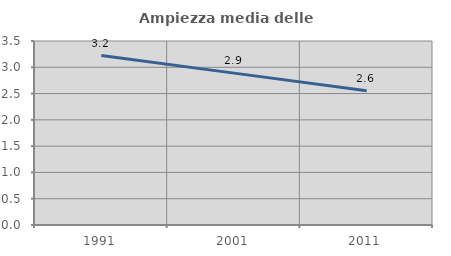
| Category | Ampiezza media delle famiglie |
|---|---|
| 1991.0 | 3.223 |
| 2001.0 | 2.889 |
| 2011.0 | 2.553 |